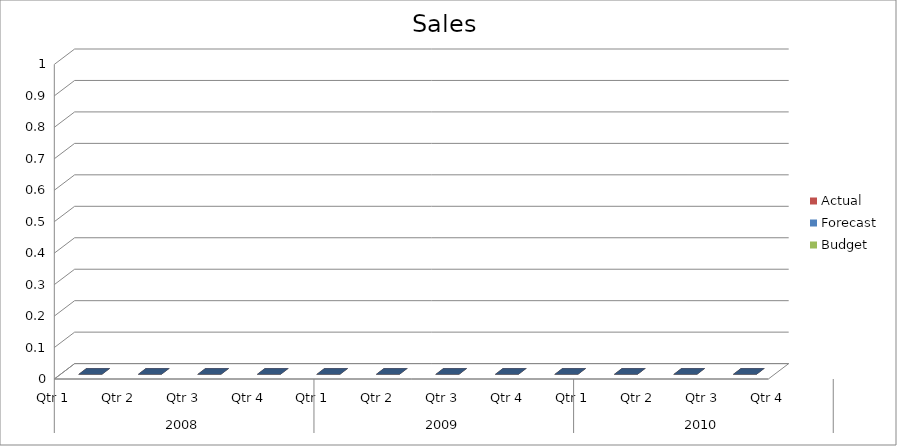
| Category | Budget | Forecast | Actual |
|---|---|---|---|
| 0 | 990 | 2360 | 2770 |
| 1 | 1780 | 1950 | 1480 |
| 2 | 1820 | 970 | 3020 |
| 3 | 3430 | 2580 | 3070 |
| 4 | 2690 | 1300 | 1610 |
| 5 | 910 | 3390 | 3300 |
| 6 | 2290 | 1370 | 1640 |
| 7 | 2280 | 1980 | 1380 |
| 8 | 1050 | 1100 | 3340 |
| 9 | 2830 | 690 | 1740 |
| 10 | 2270 | 2290 | 1030 |
| 11 | 1290 | 3360 | 1220 |